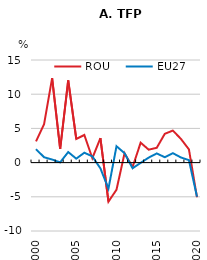
| Category | ROU | EU27 |
|---|---|---|
| 2000.0 | 3.103 | 1.959 |
| 2001.0 | 5.625 | 0.786 |
| 2002.0 | 12.353 | 0.449 |
| 2003.0 | 1.987 | 0.037 |
| 2004.0 | 12.033 | 1.542 |
| 2005.0 | 3.46 | 0.577 |
| 2006.0 | 4.038 | 1.445 |
| 2007.0 | 0.641 | 0.911 |
| 2008.0 | 3.573 | -0.842 |
| 2009.0 | -5.712 | -3.809 |
| 2010.0 | -3.957 | 2.393 |
| 2011.0 | 1.358 | 1.372 |
| 2012.0 | -0.653 | -0.83 |
| 2013.0 | 2.911 | -0.034 |
| 2014.0 | 1.892 | 0.73 |
| 2015.0 | 2.163 | 1.34 |
| 2016.0 | 4.208 | 0.787 |
| 2017.0 | 4.684 | 1.381 |
| 2018.0 | 3.475 | 0.756 |
| 2019.0 | 1.931 | 0.357 |
| 2020.0 | -5.064 | -4.98 |